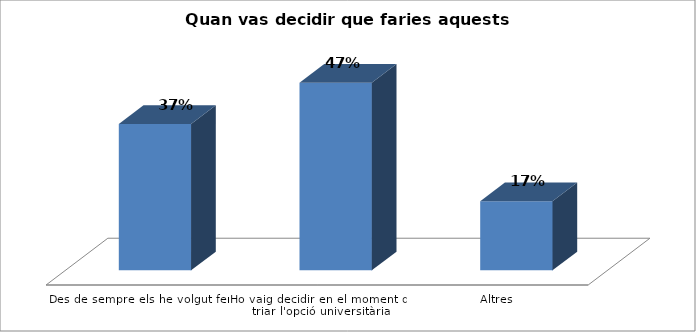
| Category | Series 0 |
|---|---|
| Des de sempre els he volgut fer | 0.369 |
| Ho vaig decidir en el moment de triar l'opció universitària | 0.473 |
| Altres | 0.174 |